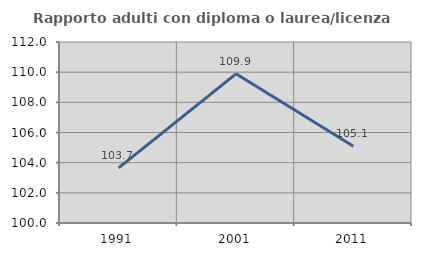
| Category | Rapporto adulti con diploma o laurea/licenza media  |
|---|---|
| 1991.0 | 103.659 |
| 2001.0 | 109.89 |
| 2011.0 | 105.085 |